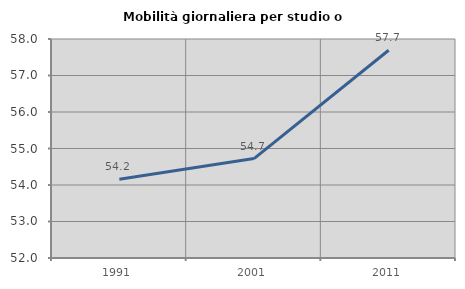
| Category | Mobilità giornaliera per studio o lavoro |
|---|---|
| 1991.0 | 54.16 |
| 2001.0 | 54.724 |
| 2011.0 | 57.692 |